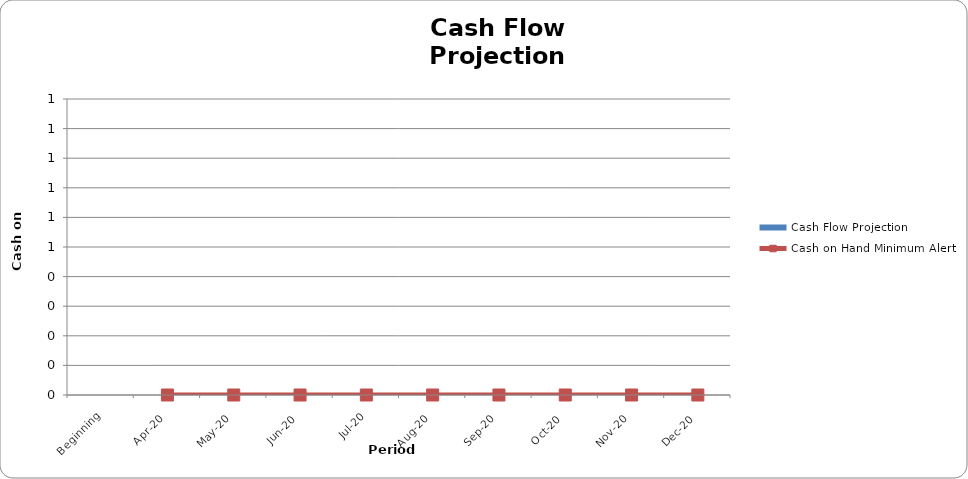
| Category | Cash Flow Projection |
|---|---|
| Beginning | 0 |
| Apr-20 | 0 |
| May-20 | 0 |
| Jun-20 | 0 |
| Jul-20 | 0 |
| Aug-20 | 0 |
| Sep-20 | 0 |
| Oct-20 | 0 |
| Nov-20 | 0 |
| Dec-20 | 0 |